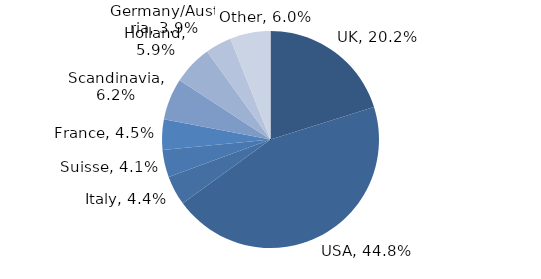
| Category | Investment Style |
|---|---|
| UK | 0.202 |
| USA | 0.448 |
| Italy | 0.044 |
| Suisse | 0.041 |
| France | 0.045 |
| Scandinavia | 0.062 |
| Holland | 0.059 |
| Germany/Austria | 0.039 |
| Other | 0.06 |